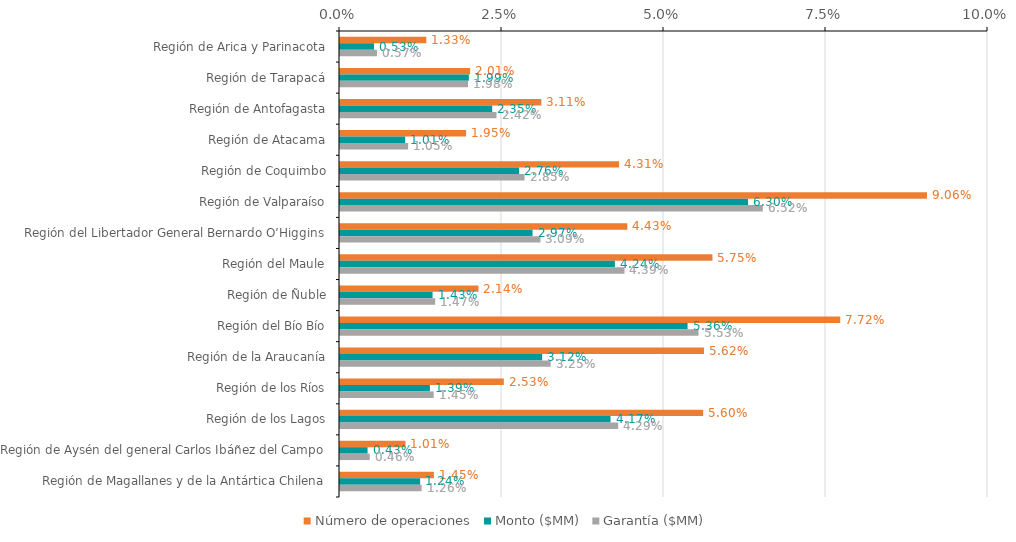
| Category | Número de operaciones | Monto ($MM) | Garantía ($MM) |
|---|---|---|---|
| Región de Arica y Parinacota | 0.013 | 0.005 | 0.006 |
| Región de Tarapacá | 0.02 | 0.02 | 0.02 |
| Región de Antofagasta | 0.031 | 0.023 | 0.024 |
| Región de Atacama | 0.019 | 0.01 | 0.011 |
| Región de Coquimbo | 0.043 | 0.028 | 0.028 |
| Región de Valparaíso | 0.091 | 0.063 | 0.065 |
| Región del Libertador General Bernardo O’Higgins | 0.044 | 0.03 | 0.031 |
| Región del Maule | 0.057 | 0.042 | 0.044 |
| Región de Ñuble | 0.021 | 0.014 | 0.015 |
| Región del Bío Bío | 0.077 | 0.054 | 0.055 |
| Región de la Araucanía | 0.056 | 0.031 | 0.033 |
| Región de los Ríos | 0.025 | 0.014 | 0.014 |
| Región de los Lagos | 0.056 | 0.042 | 0.043 |
| Región de Aysén del general Carlos Ibáñez del Campo | 0.01 | 0.004 | 0.005 |
| Región de Magallanes y de la Antártica Chilena | 0.014 | 0.012 | 0.013 |